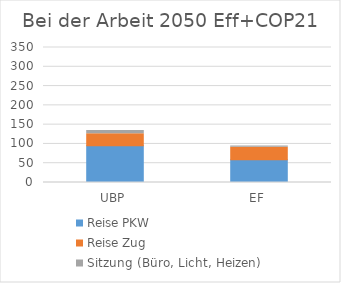
| Category | Reise PKW | Reise Zug | Sitzung (Büro, Licht, Heizen) |
|---|---|---|---|
| UBP | 95.295 | 31.023 | 8.225 |
| EF | 59.078 | 32.434 | 3.276 |